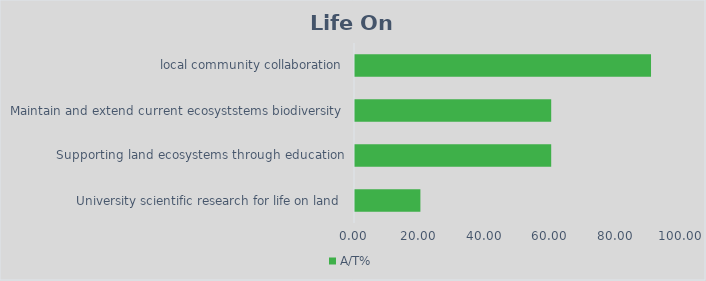
| Category | A/T% |
|---|---|
| University scientific research for life on land | 20 |
| Supporting land ecosystems through education | 60 |
| Maintain and extend current ecosyststems biodiversity | 60 |
| local community collaboration | 90.526 |